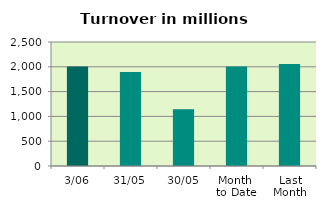
| Category | Series 0 |
|---|---|
| 3/06 | 2008.352 |
| 31/05 | 1894.323 |
| 30/05 | 1146.566 |
| Month 
to Date | 2008.352 |
| Last
Month | 2056.808 |